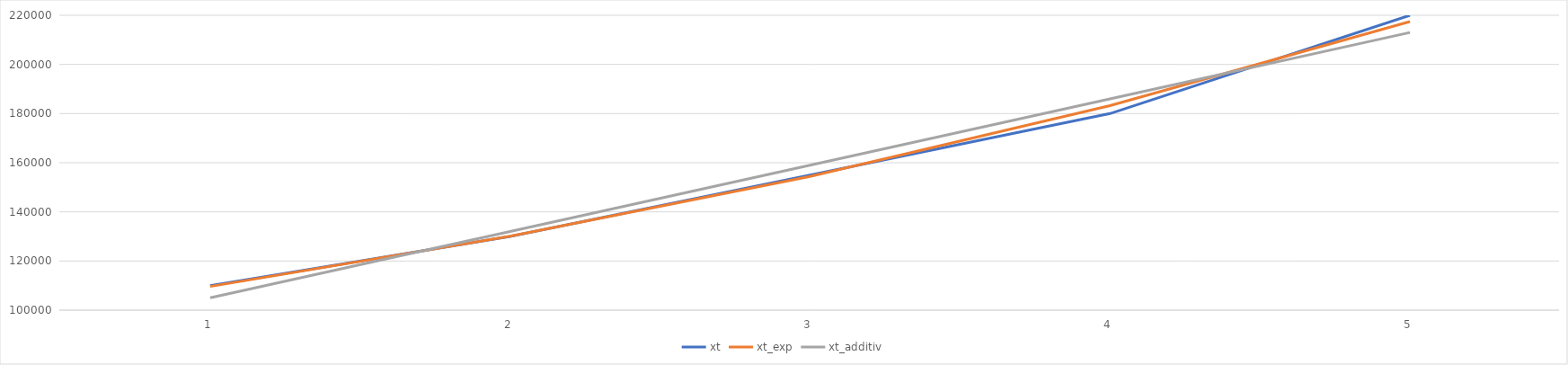
| Category | xt | xt_exp | xt_additiv |
|---|---|---|---|
| 0 | 110000 | 109646.496 | 105000 |
| 1 | 130000 | 130116.889 | 132000 |
| 2 | 155000 | 154408.991 | 159000 |
| 3 | 180000 | 183236.294 | 186000 |
| 4 | 220000 | 217445.494 | 213000 |